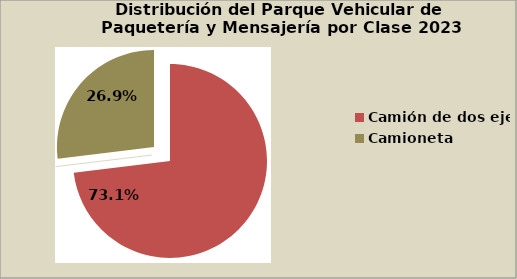
| Category | Series 0 |
|---|---|
| Camión de dos ejes | 73.1 |
| Camión de tres ejes | 0.027 |
| Camioneta | 26.931 |